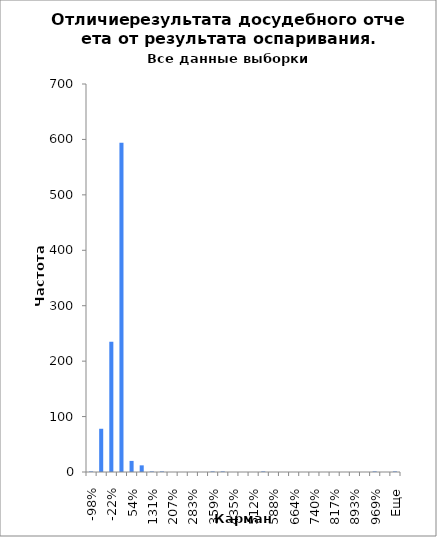
| Category | Частота |
|---|---|
| -98% | 1 |
| -60% | 78 |
| -22% | 235 |
| 16% | 594 |
| 54% | 20 |
| 93% | 12 |
| 131% | 1 |
| 169% | 1 |
| 207% | 0 |
| 245% | 0 |
| 283% | 0 |
| 321% | 0 |
| 359% | 1 |
| 397% | 1 |
| 435% | 0 |
| 474% | 0 |
| 512% | 0 |
| 550% | 1 |
| 588% | 0 |
| 626% | 0 |
| 664% | 0 |
| 702% | 0 |
| 740% | 0 |
| 778% | 0 |
| 817% | 0 |
| 855% | 0 |
| 893% | 0 |
| 931% | 0 |
| 969% | 1 |
| 1007% | 0 |
| Еще | 1 |